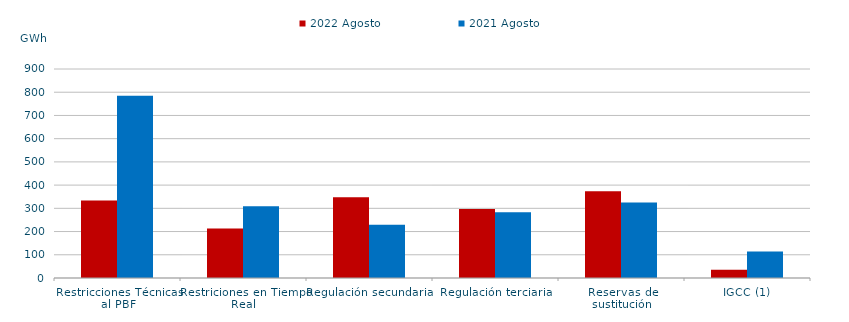
| Category | 2022 Agosto | 2021 Agosto |
|---|---|---|
| Restricciones Técnicas al PBF | 334.073 | 785.189 |
| Restriciones en Tiempo Real | 213.24 | 308.979 |
| Regulación secundaria | 347.729 | 229.221 |
| Regulación terciaria | 297.205 | 283.532 |
| Reservas de sustitución | 373.69 | 325.085 |
| IGCC (1) | 35.87 | 113.795 |